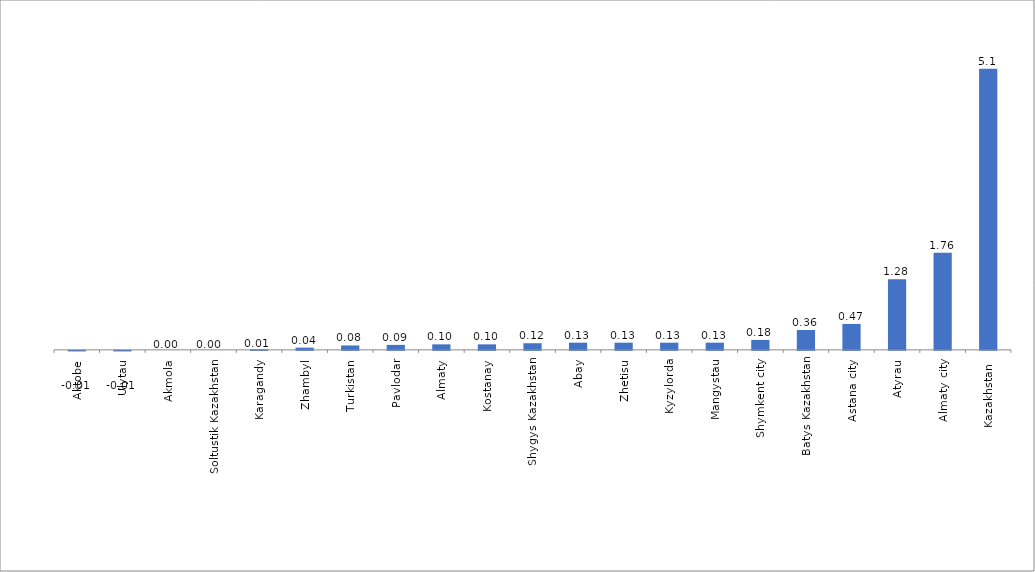
| Category | Series 0 |
|---|---|
| Aktobe | -0.01 |
| Ulytau | -0.01 |
| Akmola | 0 |
| Soltustik Kazakhstan | 0 |
| Karagandy | 0.01 |
| Zhambyl | 0.04 |
| Turkistan | 0.08 |
| Pavlodar | 0.09 |
| Almaty | 0.1 |
| Kostanay | 0.1 |
| Shygys Kazakhstan | 0.12 |
| Abay | 0.13 |
| Zhetisu | 0.13 |
| Kyzylorda | 0.13 |
| Mangystau | 0.13 |
| Shymkent city | 0.18 |
| Batys Kazakhstan | 0.36 |
| Astana city | 0.47 |
| Atyrau | 1.28 |
| Almaty city | 1.76 |
| Kazakhstan  | 5.1 |